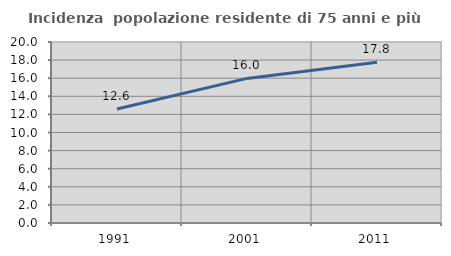
| Category | Incidenza  popolazione residente di 75 anni e più |
|---|---|
| 1991.0 | 12.598 |
| 2001.0 | 15.978 |
| 2011.0 | 17.772 |